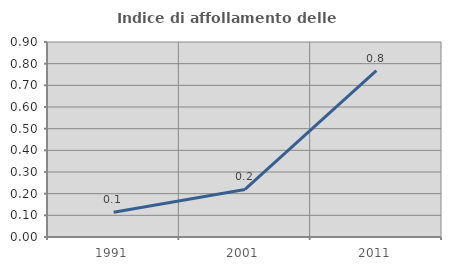
| Category | Indice di affollamento delle abitazioni  |
|---|---|
| 1991.0 | 0.115 |
| 2001.0 | 0.219 |
| 2011.0 | 0.768 |